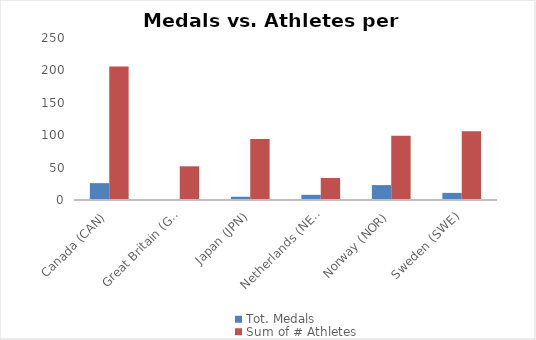
| Category | Tot. Medals | Sum of # Athletes |
|---|---|---|
|  Canada (CAN) | 26 | 206 |
|  Great Britain (GBR) | 1 | 52 |
|  Japan (JPN) | 5 | 94 |
|  Netherlands (NED) | 8 | 34 |
|  Norway (NOR) | 23 | 99 |
|  Sweden (SWE) | 11 | 106 |